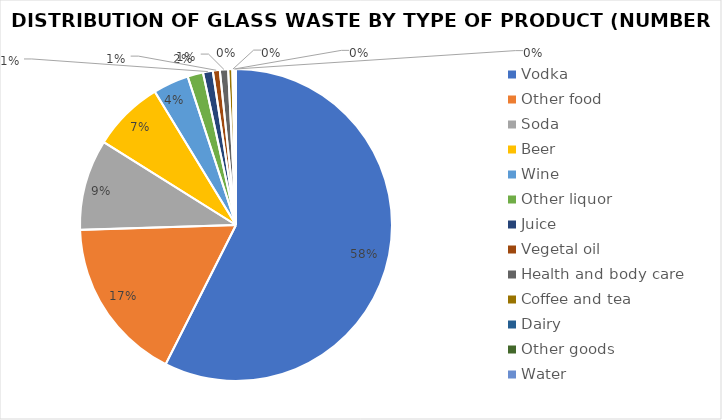
| Category | Series 0 |
|---|---|
| Vodka | 2145 |
| Other food | 637 |
| Soda | 351 |
| Beer | 276 |
| Wine | 138 |
| Other liquor | 60 |
| Juice | 38 |
| Vegetal oil | 27 |
| Health and body care | 32 |
| Coffee and tea | 16 |
| Dairy | 5 |
| Other goods | 4 |
| Water | 5 |